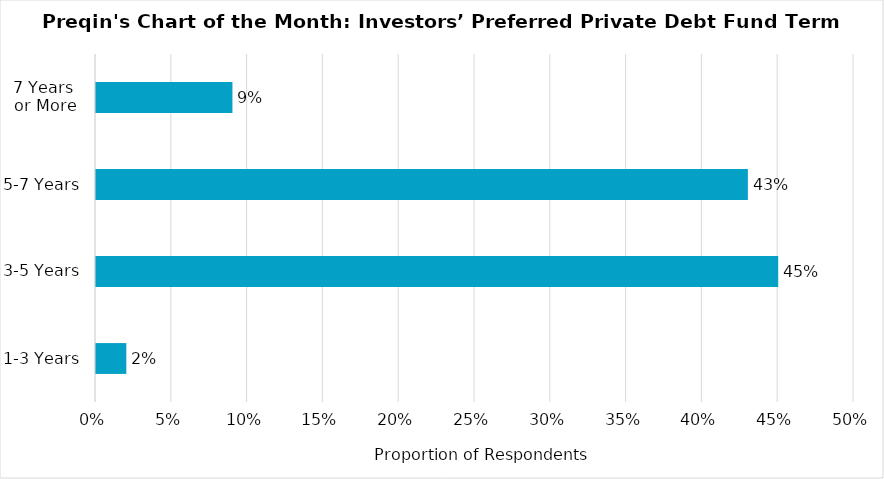
| Category | Proportion of Respondents |
|---|---|
| 1-3 Years | 0.02 |
| 3-5 Years | 0.45 |
| 5-7 Years | 0.43 |
| 7 Years 
or More | 0.09 |